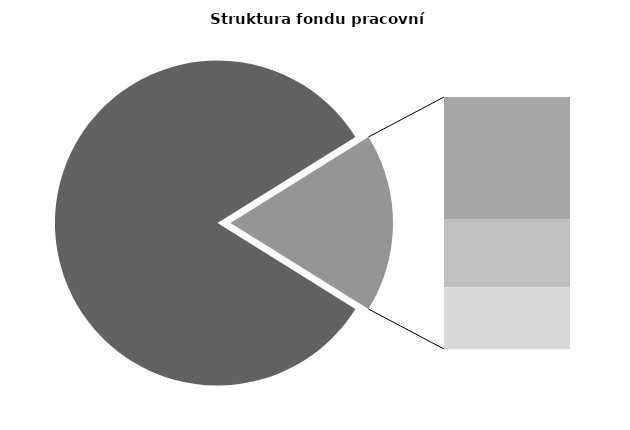
| Category | Series 0 |
|---|---|
| Průměrná měsíční odpracovaná doba bez přesčasu | 139.41 |
| Dovolená | 14.581 |
| Nemoc | 8.118 |
| Jiné | 7.386 |